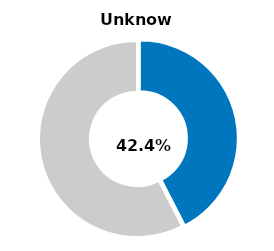
| Category | Series 0 |
|---|---|
| Unknown | 0.424 |
| Other | 0.576 |